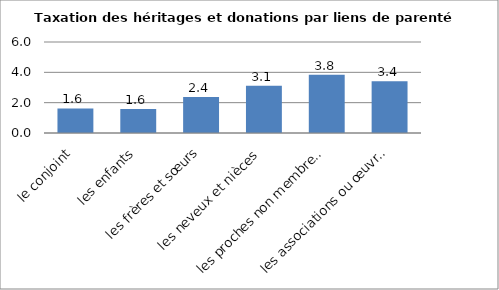
| Category | Series 0 |
|---|---|
| le conjoint | 1.62 |
| les enfants | 1.59 |
| les frères et sœurs | 2.38 |
| les neveux et nièces | 3.11 |
| les proches non membres de la famille | 3.84 |
| les associations ou œuvres d'utilité publique | 3.41 |